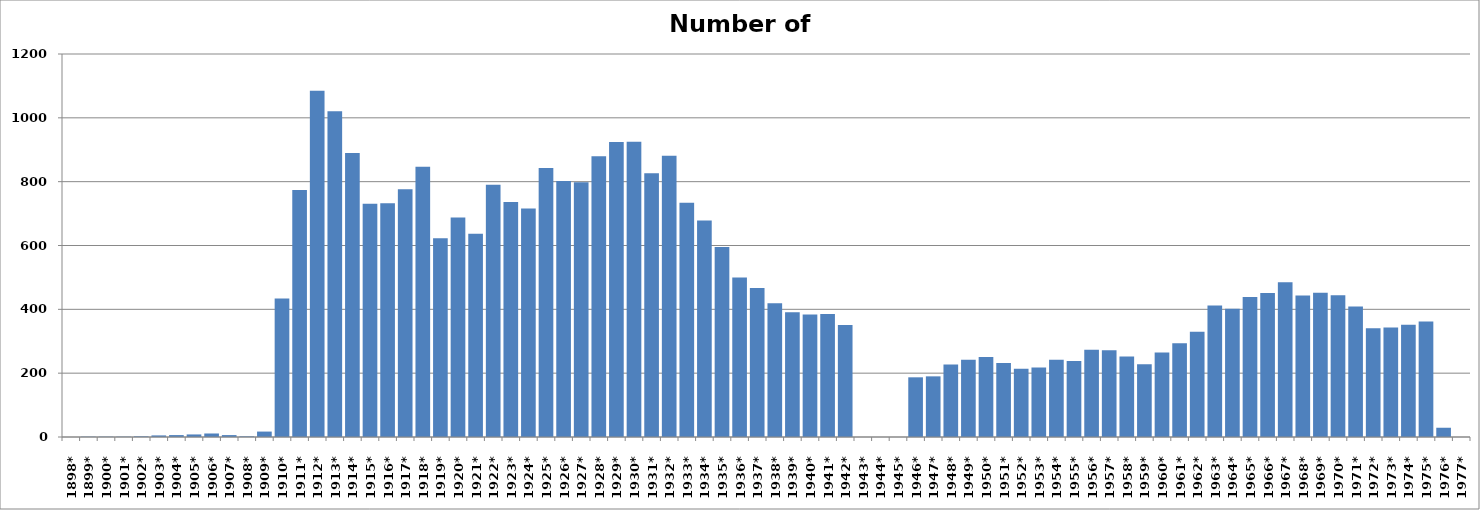
| Category | Number of cars |
|---|---|
| 1898* | 0 |
| 1899* | 1 |
| 1900* | 1 |
| 1901* | 1 |
| 1902* | 2 |
| 1903* | 5 |
| 1904* | 6 |
| 1905* | 8 |
| 1906* | 11 |
| 1907* | 6 |
| 1908* | 2 |
| 1909* | 17 |
| 1910* | 434 |
| 1911* | 774 |
| 1912* | 1085 |
| 1913* | 1021 |
| 1914* | 890 |
| 1915* | 731 |
| 1916* | 732 |
| 1917* | 776 |
| 1918* | 847 |
| 1919* | 623 |
| 1920* | 688 |
| 1921* | 637 |
| 1922* | 790 |
| 1923* | 736 |
| 1924* | 716 |
| 1925* | 843 |
| 1926* | 802 |
| 1927* | 798 |
| 1928* | 880 |
| 1929* | 924 |
| 1930* | 925 |
| 1931* | 826 |
| 1932* | 881 |
| 1933* | 734 |
| 1934* | 678 |
| 1935* | 595 |
| 1936* | 500 |
| 1937* | 467 |
| 1938* | 419 |
| 1939* | 391 |
| 1940* | 384 |
| 1941* | 385 |
| 1942* | 351 |
| 1943* | 0 |
| 1944* | 0 |
| 1945* | 0 |
| 1946* | 187 |
| 1947* | 190 |
| 1948* | 227 |
| 1949* | 242 |
| 1950* | 251 |
| 1951* | 232 |
| 1952* | 214 |
| 1953* | 218 |
| 1954* | 242 |
| 1955* | 238 |
| 1956* | 273 |
| 1957* | 272 |
| 1958* | 252 |
| 1959* | 228 |
| 1960* | 265 |
| 1961* | 294 |
| 1962* | 330 |
| 1963* | 412 |
| 1964* | 402 |
| 1965* | 439 |
| 1966* | 451 |
| 1967* | 485 |
| 1968* | 443 |
| 1969* | 452 |
| 1970* | 444 |
| 1971* | 409 |
| 1972* | 341 |
| 1973* | 343 |
| 1974* | 352 |
| 1975* | 362 |
| 1976* | 29 |
| 1977* | 0 |